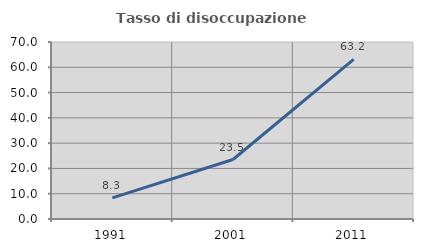
| Category | Tasso di disoccupazione giovanile  |
|---|---|
| 1991.0 | 8.333 |
| 2001.0 | 23.529 |
| 2011.0 | 63.158 |